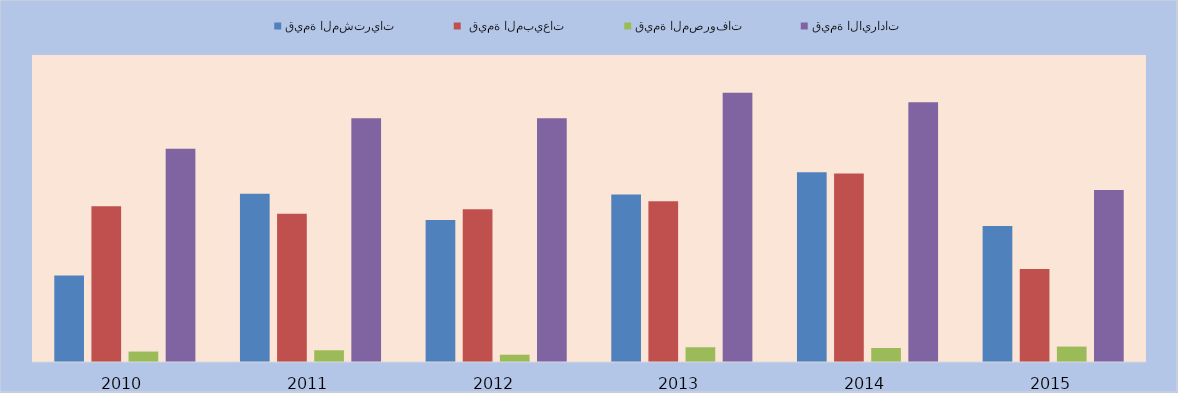
| Category | قيمة المشتريات |  قيمة المبيعات | قيمة المصروفات | قيمة الايرادات |
|---|---|---|---|---|
| 2010.0 | 5632 | 10141 | 681 | 13889 |
| 2011.0 | 10968 | 9663 | 764 | 15873 |
| 2012.0 | 9245 | 9953 | 474 | 15878 |
| 2013.0 | 10918 | 10467 | 962 | 17537 |
| 2014.0 | 12365 | 12272 | 912 | 16928 |
| 2015.0 | 8856 | 6053 | 1005 | 11204 |